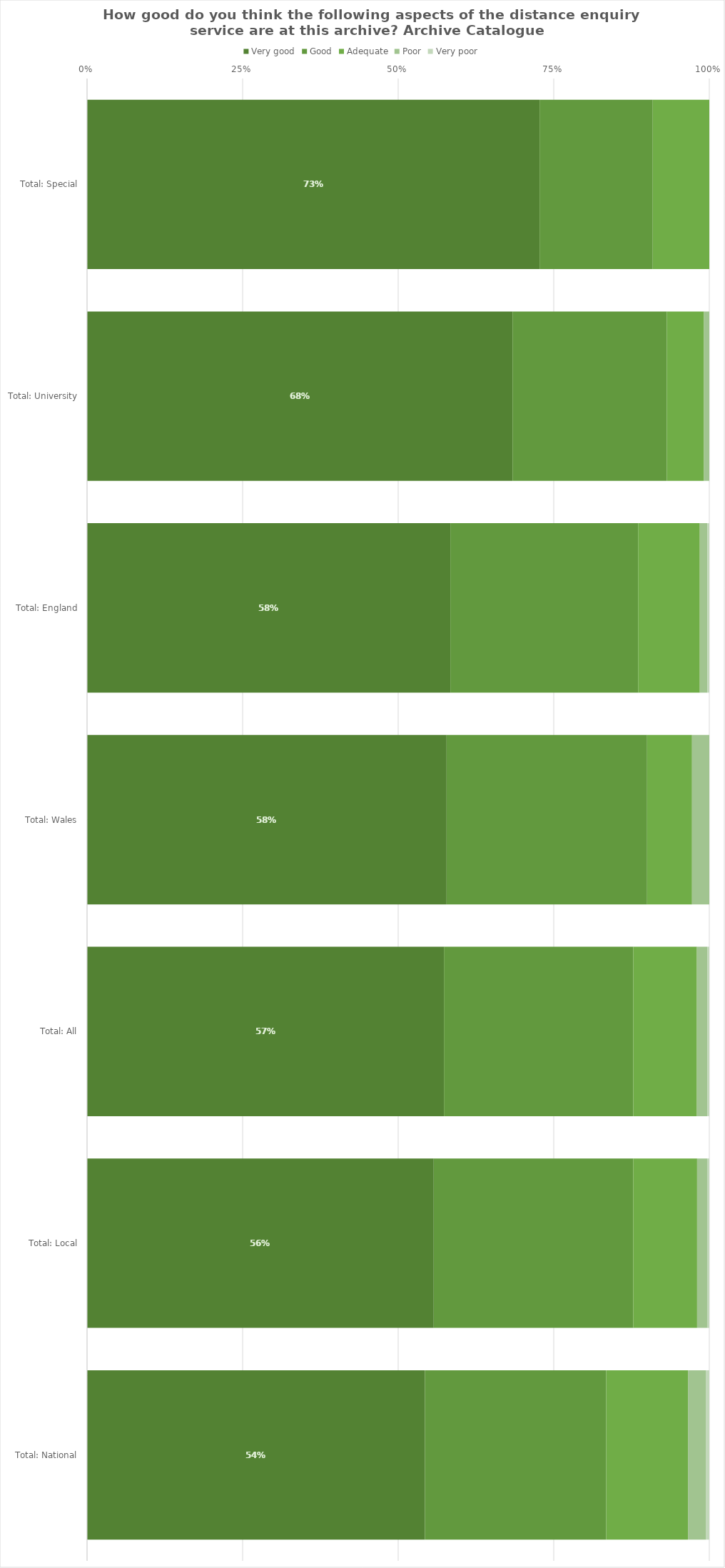
| Category | Very good | Good | Adequate | Poor | Very poor |
|---|---|---|---|---|---|
| Total: Special | 0.727 | 0.182 | 0.091 | 0 | 0 |
| Total: University | 0.684 | 0.248 | 0.06 | 0.009 | 0 |
| Total: England | 0.584 | 0.302 | 0.099 | 0.012 | 0.003 |
| Total: Wales | 0.578 | 0.322 | 0.072 | 0.028 | 0 |
| Total: All | 0.574 | 0.304 | 0.102 | 0.017 | 0.003 |
| Total: Local | 0.557 | 0.321 | 0.103 | 0.016 | 0.003 |
| Total: National | 0.543 | 0.291 | 0.131 | 0.029 | 0.006 |